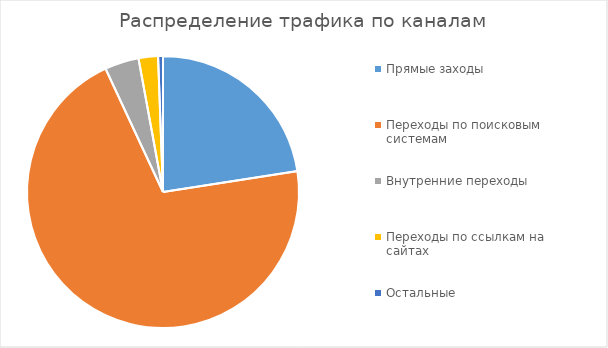
| Category | Series 0 |
|---|---|
| Прямые заходы | 78 |
| Переходы по поисковым системам | 244 |
| Внутренние переходы | 14 |
| Переходы по ссылкам на сайтах | 8 |
| Остальные | 2 |